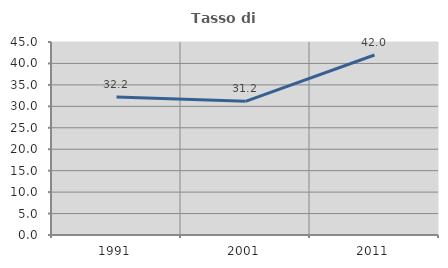
| Category | Tasso di occupazione   |
|---|---|
| 1991.0 | 32.182 |
| 2001.0 | 31.16 |
| 2011.0 | 41.976 |